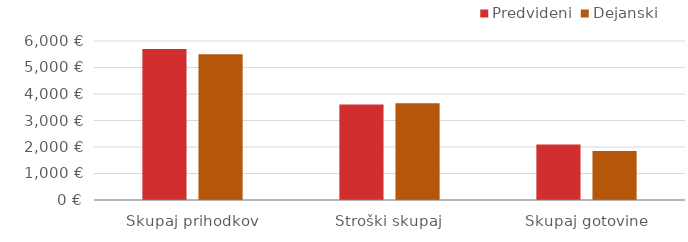
| Category | Predvideni | Dejanski |
|---|---|---|
| Skupaj prihodkov | 5700 | 5500 |
| Stroški skupaj | 3603 | 3655 |
| Skupaj gotovine | 2097 | 1845 |